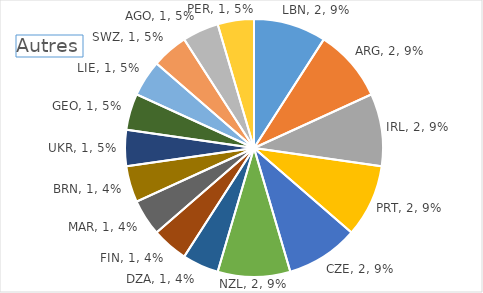
| Category | Series 0 |
|---|---|
| LBN | 2 |
| ARG | 2 |
| IRL | 2 |
| PRT | 2 |
| CZE | 2 |
| NZL | 2 |
| DZA | 1 |
| FIN | 1 |
| MAR | 1 |
| BRN | 1 |
| UKR | 1 |
| GEO | 1 |
| LIE | 1 |
| SWZ | 1 |
| AGO | 1 |
| PER | 1 |